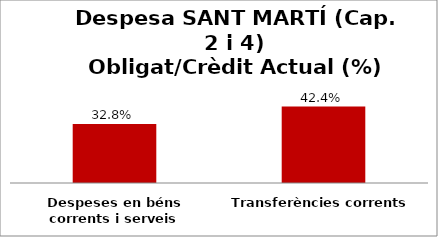
| Category | Series 0 |
|---|---|
| Despeses en béns corrents i serveis | 0.328 |
| Transferències corrents | 0.424 |